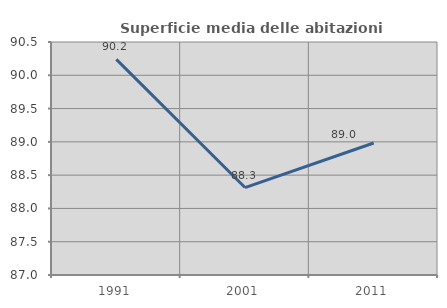
| Category | Superficie media delle abitazioni occupate |
|---|---|
| 1991.0 | 90.238 |
| 2001.0 | 88.314 |
| 2011.0 | 88.983 |